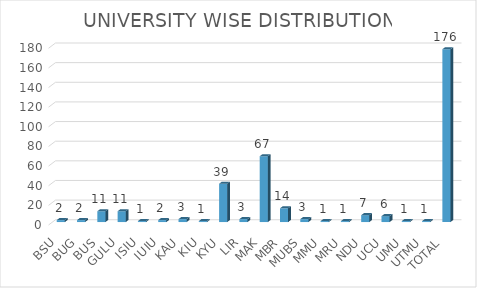
| Category | Series 0 |
|---|---|
| BSU | 2 |
| BUG | 2 |
| BUS | 11 |
| GULU | 11 |
| ISIU | 1 |
| IUIU | 2 |
| KAU | 3 |
| KIU | 1 |
| KYU | 39 |
| LIR | 3 |
| MAK | 67 |
| MBR | 14 |
| MUBS | 3 |
| MMU | 1 |
| MRU | 1 |
| NDU | 7 |
| UCU | 6 |
| UMU | 1 |
| UTMU | 1 |
| TOTAL | 176 |